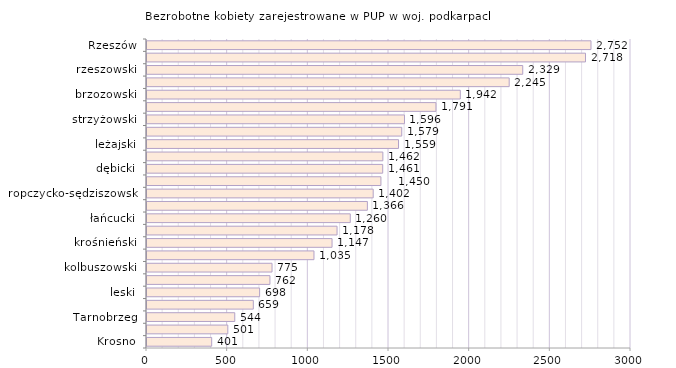
| Category | Bezrobotne kobiety zarejestrowane w PUP w woj. podkarpackim |
|---|---|
| Krosno | 401 |
| bieszczadzki | 501 |
| Tarnobrzeg | 544 |
| tarnobrzeski  | 659 |
| leski | 698 |
| lubaczowski | 762 |
| kolbuszowski | 775 |
| stalowowolski | 1035 |
| krośnieński | 1147 |
| Przemyśl | 1178 |
| łańcucki | 1260 |
| sanocki | 1366 |
| ropczycko-sędziszowski | 1402 |
| przemyski | 1450 |
| dębicki | 1461 |
| mielecki | 1462 |
| leżajski | 1559 |
| niżański | 1579 |
| strzyżowski | 1596 |
| przeworski | 1791 |
| brzozowski | 1942 |
| jarosławski | 2245 |
| rzeszowski | 2329 |
| jasielski | 2718 |
| Rzeszów | 2752 |